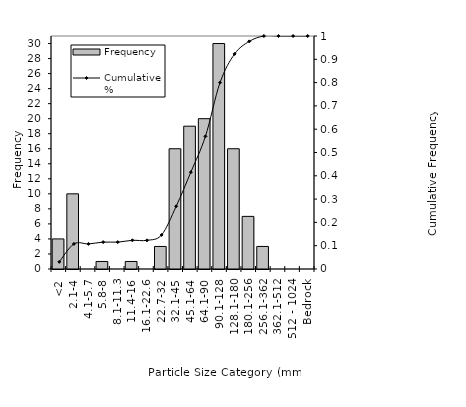
| Category | Frequency |
|---|---|
| <2 | 4 |
| 2.1-4 | 10 |
| 4.1-5.7 | 0 |
| 5.8-8 | 1 |
| 8.1-11.3 | 0 |
| 11.4-16 | 1 |
| 16.1-22.6 | 0 |
| 22.7-32 | 3 |
| 32.1-45 | 16 |
| 45.1-64 | 19 |
| 64.1-90 | 20 |
| 90.1-128 | 30 |
| 128.1-180 | 16 |
| 180.1-256 | 7 |
| 256.1-362 | 3 |
| 362.1-512 | 0 |
| 512 - 1024 | 0 |
| Bedrock | 0 |